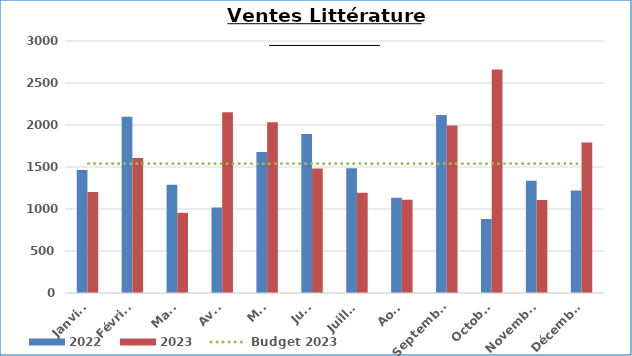
| Category | 2022 | 2023 |
|---|---|---|
| Janvier | 1463.5 | 1202.5 |
| Février | 2097.5 | 1607.8 |
| Mars | 1289.9 | 955.1 |
| Avril | 1018.1 | 2150.9 |
| Mai | 1678.4 | 2033.9 |
| Juin | 1892.75 | 1481.6 |
| Juillet | 1486.1 | 1193 |
| Août | 1133 | 1111 |
| Septembre | 2119.9 | 1995.4 |
| Octobre | 881.1 | 2660 |
| Novembre | 1336.3 | 1108.2 |
| Décembre | 1219.1 | 1791.4 |